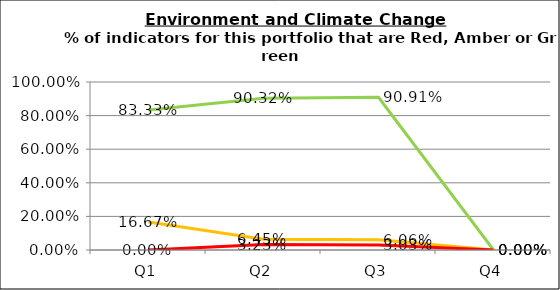
| Category | Green | Amber | Red |
|---|---|---|---|
| Q1 | 0.833 | 0.167 | 0 |
| Q2 | 0.903 | 0.065 | 0.032 |
| Q3 | 0.909 | 0.061 | 0.03 |
| Q4 | 0 | 0 | 0 |